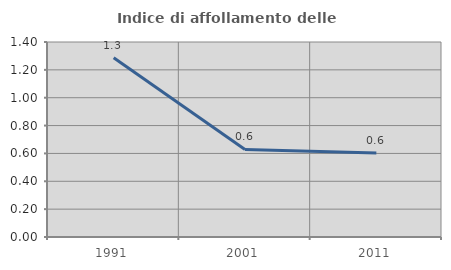
| Category | Indice di affollamento delle abitazioni  |
|---|---|
| 1991.0 | 1.288 |
| 2001.0 | 0.629 |
| 2011.0 | 0.602 |